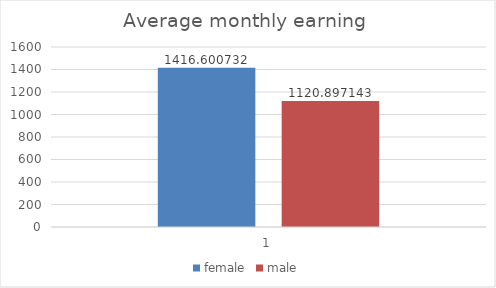
| Category | female | male |
|---|---|---|
| 0 | 1416.601 | 1120.897 |